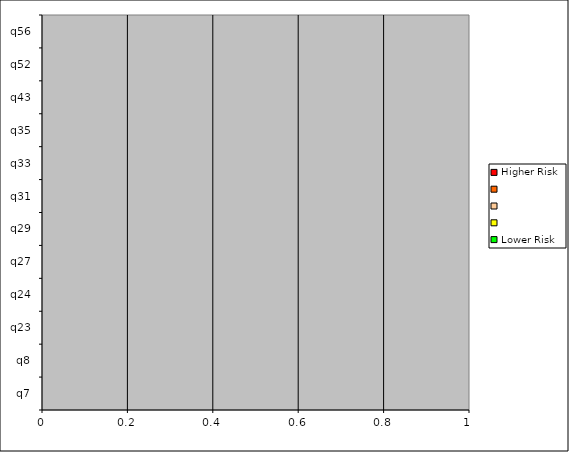
| Category | Higher Risk |   | Lower Risk |
|---|---|---|---|
| q7 | 0 | 0 | 0 |
| q8 | 0 | 0 | 0 |
| q23 | 0 | 0 | 0 |
| q24 | 0 | 0 | 0 |
| q27 | 0 | 0 | 0 |
| q29 | 0 | 0 | 0 |
| q31 | 0 | 0 | 0 |
| q33 | 0 | 0 | 0 |
| q35 | 0 | 0 | 0 |
| q43 | 0 | 0 | 0 |
| q52 | 0 | 0 | 0 |
| q56 | 0 | 0 | 0 |